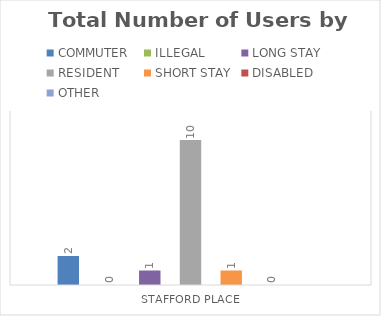
| Category | COMMUTER | ILLEGAL | LONG STAY | RESIDENT | SHORT STAY | DISABLED | OTHER |
|---|---|---|---|---|---|---|---|
| STAFFORD PLACE | 2 | 0 | 1 | 10 | 1 | 0 | 0 |